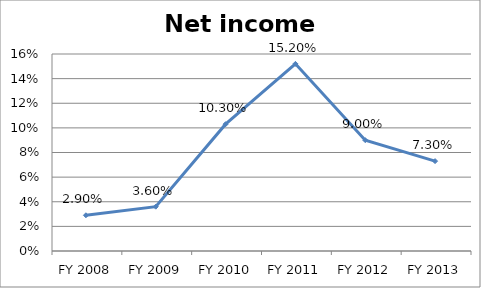
| Category | Net income ratio |
|---|---|
| FY 2013 | 0.073 |
| FY 2012 | 0.09 |
| FY 2011 | 0.152 |
| FY 2010 | 0.103 |
| FY 2009 | 0.036 |
| FY 2008 | 0.029 |